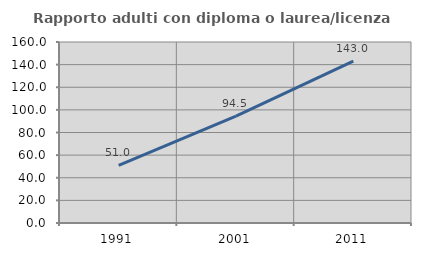
| Category | Rapporto adulti con diploma o laurea/licenza media  |
|---|---|
| 1991.0 | 51.008 |
| 2001.0 | 94.517 |
| 2011.0 | 143.042 |